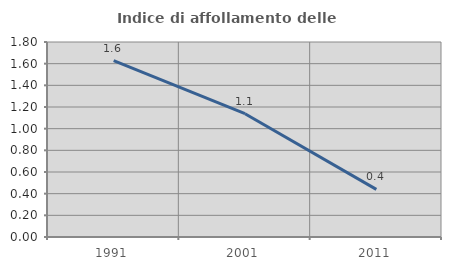
| Category | Indice di affollamento delle abitazioni  |
|---|---|
| 1991.0 | 1.628 |
| 2001.0 | 1.138 |
| 2011.0 | 0.44 |